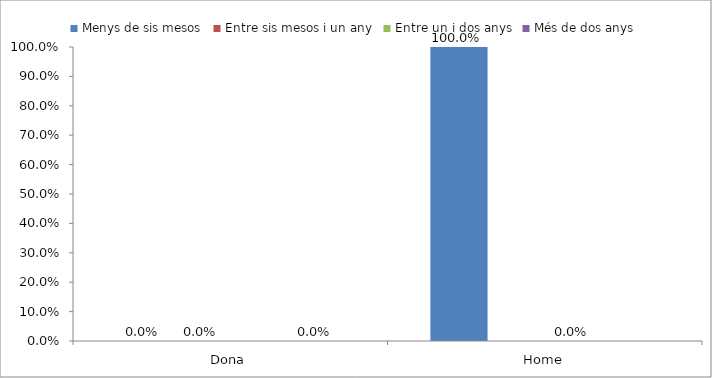
| Category | Menys de sis mesos | Entre sis mesos i un any | Entre un i dos anys | Més de dos anys |
|---|---|---|---|---|
| Dona | 0 | 0 | 0 | 0 |
| Home | 1 | 0 | 0 | 0 |